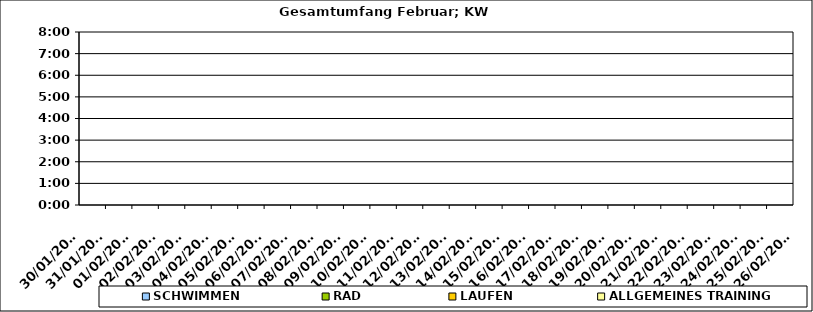
| Category | SCHWIMMEN | RAD | LAUFEN | ALLGEMEINES TRAINING |
|---|---|---|---|---|
| 30/01/2023 |  |  |  | 0 |
| 31/01/2023 |  |  |  | 0 |
| 01/02/2023 |  |  |  | 0 |
| 02/02/2023 |  |  |  | 0 |
| 03/02/2023 |  |  |  | 0 |
| 04/02/2023 |  |  |  | 0 |
| 05/02/2023 |  |  |  | 0 |
| 06/02/2023 |  |  |  | 0 |
| 07/02/2023 |  |  |  | 0 |
| 08/02/2023 |  |  |  | 0 |
| 09/02/2023 |  |  |  | 0 |
| 10/02/2023 |  |  |  | 0 |
| 11/02/2023 |  |  |  | 0 |
| 12/02/2023 |  |  |  | 0 |
| 13/02/2023 |  |  |  | 0 |
| 14/02/2023 |  |  |  | 0 |
| 15/02/2023 |  |  |  | 0 |
| 16/02/2023 |  |  |  | 0 |
| 17/02/2023 |  |  |  | 0 |
| 18/02/2023 |  |  |  | 0 |
| 19/02/2023 |  |  |  | 0 |
| 20/02/2023 |  |  |  | 0 |
| 21/02/2023 |  |  |  | 0 |
| 22/02/2023 |  |  |  | 0 |
| 23/02/2023 |  |  |  | 0 |
| 24/02/2023 |  |  |  | 0 |
| 25/02/2023 |  |  |  | 0 |
| 26/02/2023 |  |  |  | 0 |